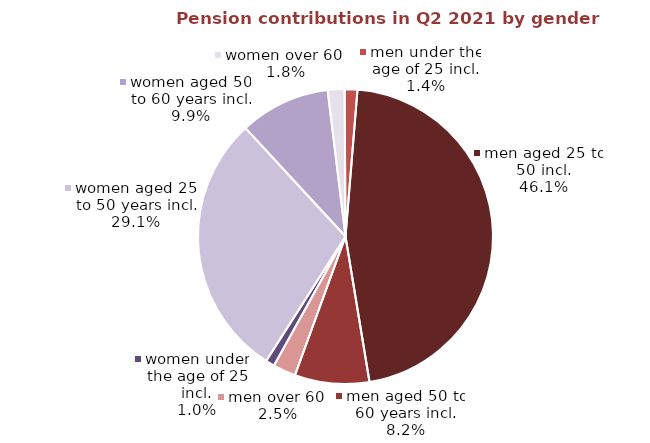
| Category | Series 0 |
|---|---|
| women under the age of 25 incl. | 0.739 |
| women aged 25 to 50 years incl. | 21.987 |
| women aged 50 to 60 years incl. | 7.5 |
| women over 60  | 1.391 |
| men under the age of 25 incl. | 1.05 |
| men aged 25 to 50 incl. | 34.823 |
| men aged 50 to 60 years incl. | 6.17 |
| men over 60  | 1.883 |